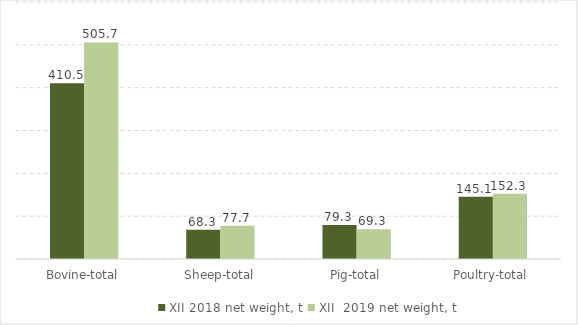
| Category | XII 2018 | XII  2019 |
|---|---|---|
| Bovine-total | 410.5 | 505.7 |
| Sheep-total | 68.3 | 77.7 |
| Pig-total | 79.3 | 69.3 |
| Poultry-total | 145.1 | 152.3 |